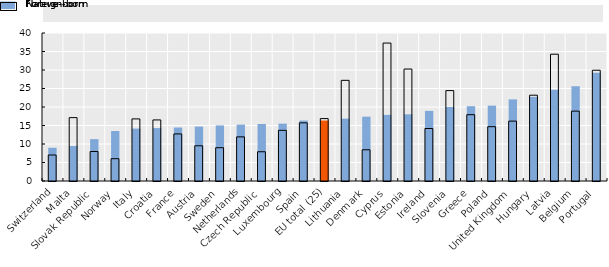
| Category | Foreign-born | Native-born |
|---|---|---|
| Switzerland | 8.978 | 7.024 |
| Malta | 9.451 | 17.126 |
| Slovak Republic | 11.316 | 7.966 |
| Norway | 13.509 | 6.028 |
| Italy | 14.172 | 16.783 |
| Croatia | 14.307 | 16.504 |
| France | 14.456 | 12.723 |
| Austria | 14.725 | 9.518 |
| Sweden | 15.025 | 9.002 |
| Netherlands | 15.226 | 11.93 |
| Czech Republic | 15.411 | 7.902 |
| Luxembourg | 15.501 | 13.695 |
| Spain | 16.336 | 15.721 |
| EU total (25) | 16.34 | 16.868 |
| Lithuania | 16.845 | 27.204 |
| Denmark | 17.382 | 8.434 |
| Cyprus | 17.872 | 37.283 |
| Estonia | 18.021 | 30.257 |
| Ireland | 18.953 | 14.188 |
| Slovenia | 20 | 24.434 |
| Greece | 20.218 | 17.924 |
| Poland | 20.372 | 14.675 |
| United Kingdom | 22.064 | 16.185 |
| Hungary | 22.734 | 23.189 |
| Latvia | 24.646 | 34.266 |
| Belgium | 25.584 | 18.884 |
| Portugal | 29.247 | 29.937 |